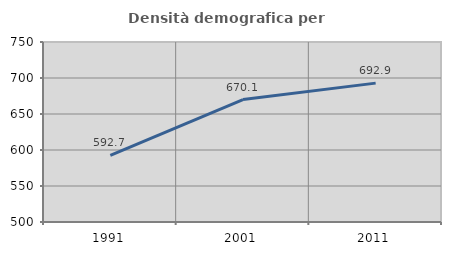
| Category | Densità demografica |
|---|---|
| 1991.0 | 592.657 |
| 2001.0 | 670.089 |
| 2011.0 | 692.883 |